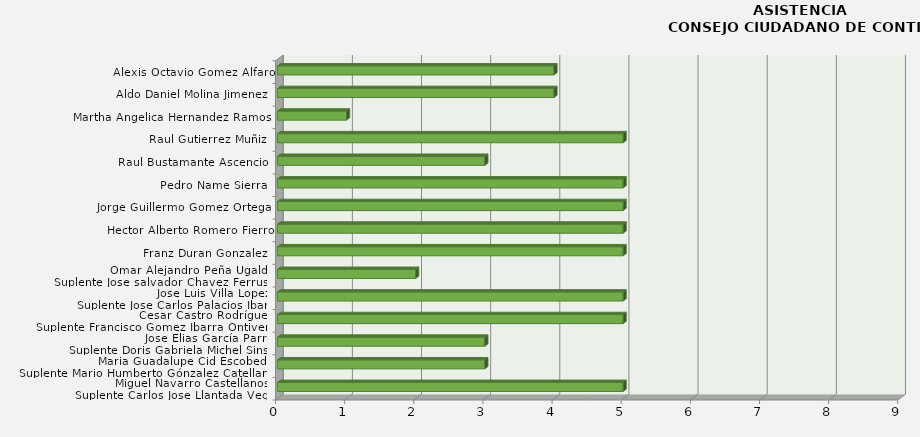
| Category | Series 0 |
|---|---|
| Miguel Navarro Castellanos/ 
Suplente Carlos Jose Llantada Vega  | 5 |
| Maria Guadalupe Cid Escobedo/
Suplente Mario Humberto Gónzalez Catellanos | 3 |
| Jose Elias García Parra/
Suplente Doris Gabriela Michel Sinsel | 3 |
| Cesar Castro Rodríguez/
Suplente Francisco Gomez Ibarra Ontiveros | 5 |
| Jose Luis Villa Lopez/
Suplente Jose Carlos Palacios Ibarra | 5 |
| Omar Alejandro Peña Ugalde/
Suplente Jose salvador Chavez Ferrusca | 2 |
| Franz Duran Gonzalez  | 5 |
| Hector Alberto Romero Fierro | 5 |
| Jorge Guillermo Gomez Ortega  | 5 |
| Pedro Name Sierra  | 5 |
| Raul Bustamante Ascencio  | 3 |
| Raul Gutierrez Muñiz  | 5 |
| Martha Angelica Hernandez Ramos  | 1 |
| Aldo Daniel Molina Jimenez  | 4 |
| Alexis Octavio Gomez Alfaro | 4 |